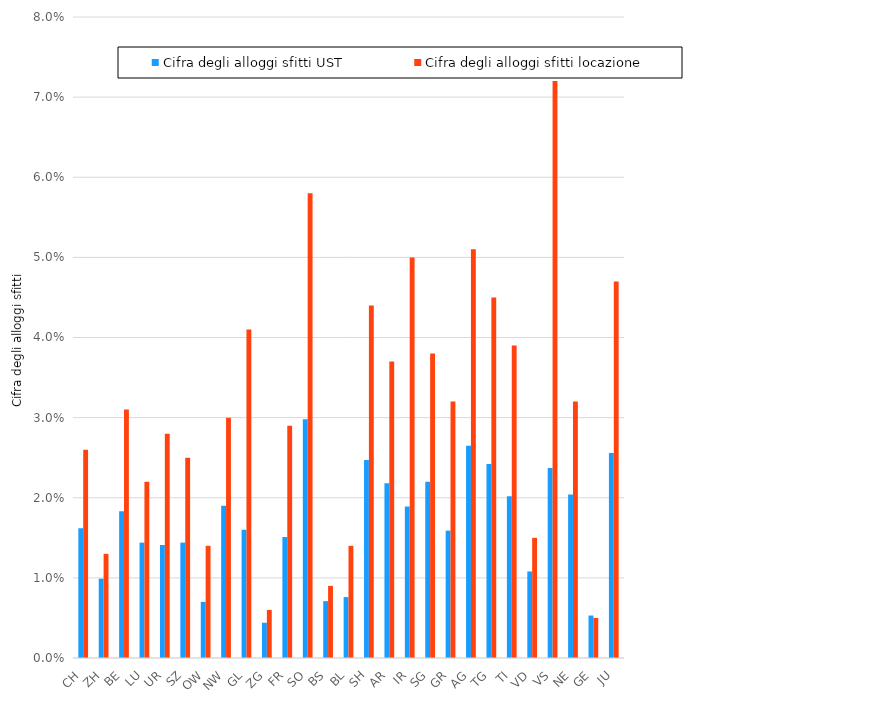
| Category | Cifra degli alloggi sfitti UST | Cifra degli alloggi sfitti locazione |
|---|---|---|
| CH | 0.016 | 0.026 |
| ZH | 0.01 | 0.013 |
| BE | 0.018 | 0.031 |
| LU | 0.014 | 0.022 |
| UR | 0.014 | 0.028 |
| SZ | 0.014 | 0.025 |
| OW | 0.007 | 0.014 |
| NW | 0.019 | 0.03 |
| GL | 0.016 | 0.041 |
| ZG | 0.004 | 0.006 |
| FR | 0.015 | 0.029 |
| SO | 0.03 | 0.058 |
| BS | 0.007 | 0.009 |
| BL | 0.008 | 0.014 |
| SH | 0.025 | 0.044 |
| AR | 0.022 | 0.037 |
| IR | 0.019 | 0.05 |
| SG | 0.022 | 0.038 |
| GR | 0.016 | 0.032 |
| AG | 0.026 | 0.051 |
| TG | 0.024 | 0.045 |
| TI | 0.02 | 0.039 |
| VD | 0.011 | 0.015 |
| VS | 0.024 | 0.072 |
| NE | 0.02 | 0.032 |
| GE | 0.005 | 0.005 |
| JU | 0.026 | 0.047 |